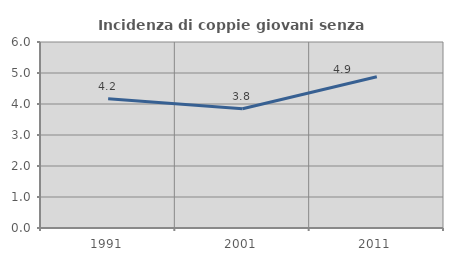
| Category | Incidenza di coppie giovani senza figli |
|---|---|
| 1991.0 | 4.167 |
| 2001.0 | 3.846 |
| 2011.0 | 4.878 |